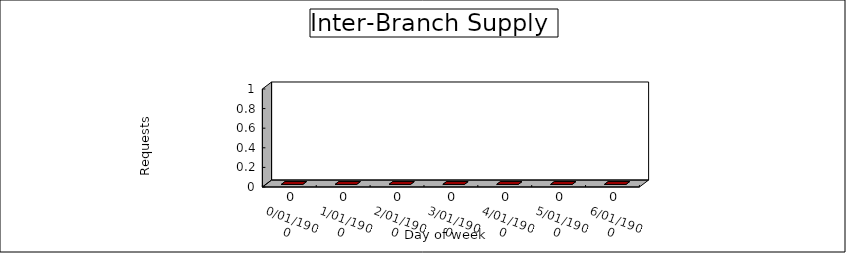
| Category | Branch Delivery |
|---|---|
| 0.0 | 0 |
| 1900-01-01 | 0 |
| 1900-01-02 | 0 |
| 1900-01-03 | 0 |
| 1900-01-04 | 0 |
| 1900-01-05 | 0 |
| 1900-01-06 | 0 |